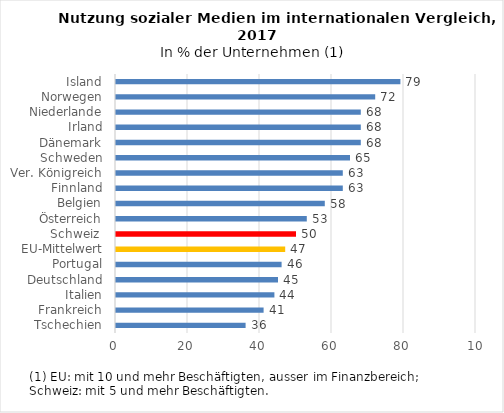
| Category | Series 0 |
|---|---|
| Tschechien | 36 |
| Frankreich | 41 |
| Italien | 44 |
| Deutschland | 45 |
| Portugal | 46 |
| EU-Mittelwert | 47 |
| Schweiz  | 50 |
| Österreich | 53 |
| Belgien | 58 |
| Finnland | 63 |
| Ver. Königreich | 63 |
| Schweden | 65 |
| Dänemark | 68 |
| Irland | 68 |
| Niederlande | 68 |
| Norwegen | 72 |
| Island | 79 |